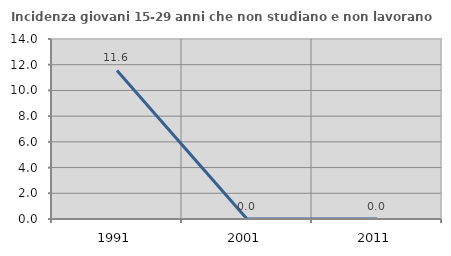
| Category | Incidenza giovani 15-29 anni che non studiano e non lavorano  |
|---|---|
| 1991.0 | 11.558 |
| 2001.0 | 0 |
| 2011.0 | 0 |